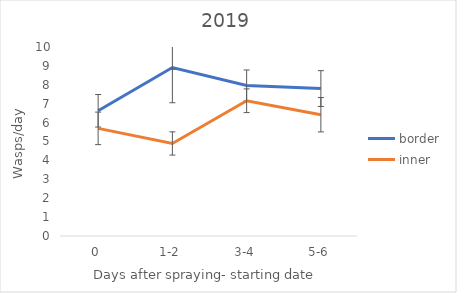
| Category | border | inner |
|---|---|---|
| 0 | 6.625 | 5.694 |
| 1-2 | 8.917 | 4.896 |
| 3-4 | 7.969 | 7.156 |
| 5-6 | 7.8 | 6.417 |